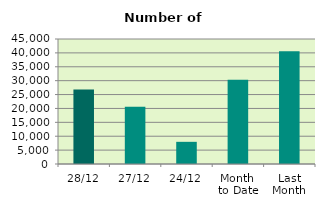
| Category | Series 0 |
|---|---|
| 28/12 | 26834 |
| 27/12 | 20628 |
| 24/12 | 7982 |
| Month 
to Date | 30308.6 |
| Last
Month | 40546.091 |